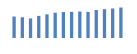
| Category | Exportações (1) |
|---|---|
| 0 | 595986.616 |
| 1 | 575965.577 |
| 2 | 544011.291 |
| 3 | 614380.205 |
| 4 | 656918.26 |
| 5 | 703504.835 |
| 6 | 720793.562 |
| 7 | 726284.803 |
| 8 | 735533.905 |
| 9 | 723973.625 |
| 10 | 778041 |
| 11 | 800341.537 |
| 12 | 819402.338 |
| 13 | 847135.41 |